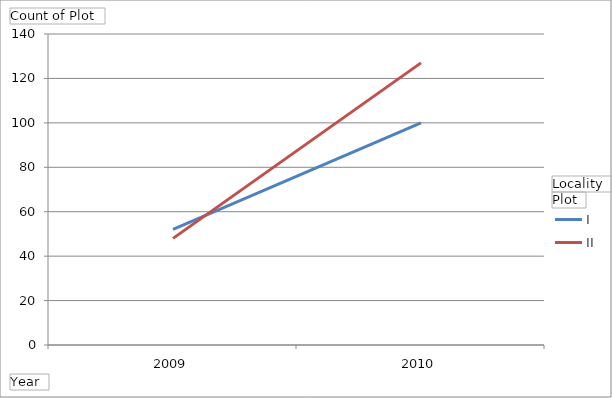
| Category | Boiling Springs - I | Boiling Springs - II |
|---|---|---|
| 2009 | 52 | 48 |
| 2010 | 100 | 127 |